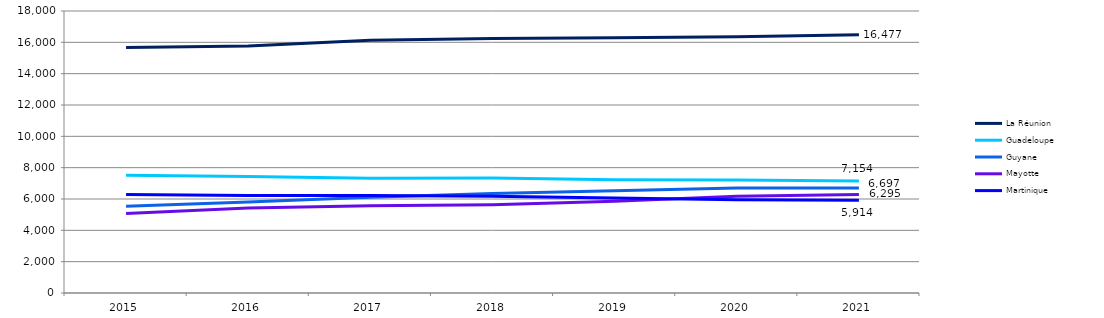
| Category | La Réunion | Guadeloupe | Guyane | Mayotte | Martinique |
|---|---|---|---|---|---|
| 2015.0 | 15671 | 7521 | 5542 | 5078 | 6292 |
| 2016.0 | 15773 | 7442 | 5811 | 5422 | 6227 |
| 2017.0 | 16137 | 7332 | 6108 | 5562 | 6223 |
| 2018.0 | 16250 | 7334 | 6346 | 5632 | 6179 |
| 2019.0 | 16299 | 7224 | 6521 | 5861 | 6069 |
| 2020.0 | 16352 | 7209 | 6698 | 6174 | 5960 |
| 2021.0 | 16477 | 7154 | 6697 | 6295 | 5914 |